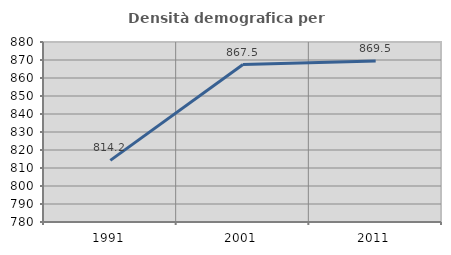
| Category | Densità demografica |
|---|---|
| 1991.0 | 814.242 |
| 2001.0 | 867.463 |
| 2011.0 | 869.457 |